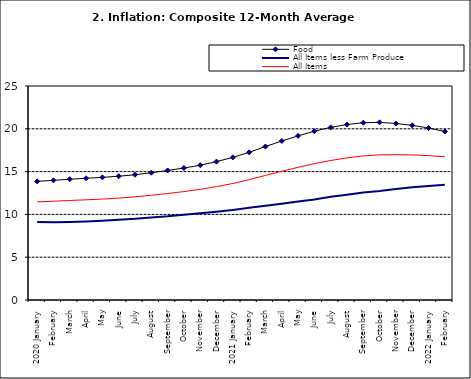
| Category | Food | All Items less Farm Produce | All Items |
|---|---|---|---|
| 2020 January | 13.859 | 9.112 | 11.462 |
| February | 13.98 | 9.086 | 11.539 |
| March | 14.109 | 9.112 | 11.624 |
| April | 14.221 | 9.174 | 11.706 |
| May | 14.325 | 9.267 | 11.791 |
| June | 14.46 | 9.375 | 11.904 |
| July | 14.634 | 9.484 | 12.049 |
| August | 14.869 | 9.638 | 12.233 |
| September | 15.135 | 9.775 | 12.44 |
| October | 15.416 | 9.965 | 12.664 |
| November | 15.746 | 10.136 | 12.923 |
| December | 16.169 | 10.308 | 13.246 |
| 2021 January | 16.662 | 10.519 | 13.616 |
| February | 17.251 | 10.767 | 14.053 |
| March | 17.929 | 11.015 | 14.554 |
| April | 18.576 | 11.247 | 15.039 |
| May | 19.176 | 11.502 | 15.499 |
| June | 19.721 | 11.75 | 15.927 |
| July | 20.165 | 12.052 | 16.298 |
| August | 20.499 | 12.291 | 16.601 |
| September | 20.711 | 12.553 | 16.83 |
| October | 20.753 | 12.725 | 16.958 |
| November | 20.619 | 12.956 | 16.979 |
| December | 20.403 | 13.161 | 16.953 |
| 2022 January | 20.089 | 13.326 | 16.869 |
| February | 19.687 | 13.461 | 16.728 |